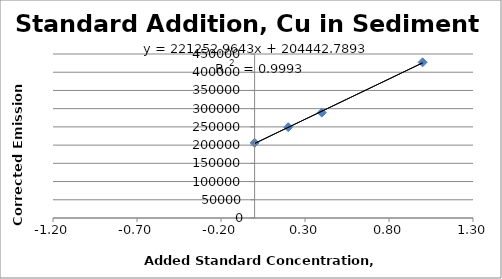
| Category | Series 0 |
|---|---|
| 0.0 | 206319.3 |
| 0.2 | 249192.7 |
| 0.4 | 289150.7 |
| 1.0 | 427113.2 |